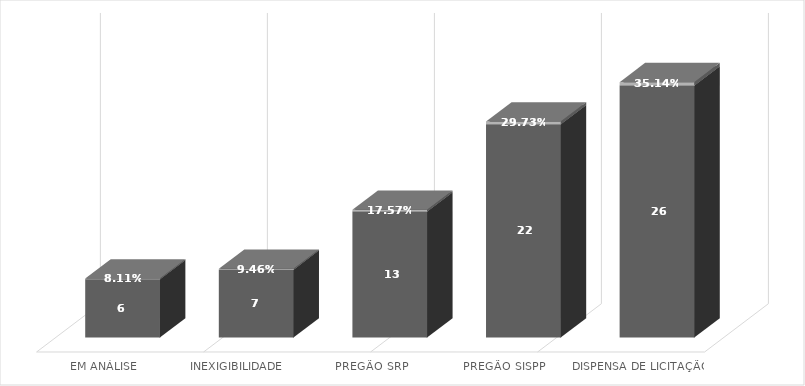
| Category | Contagem de Processo nº | Contagem de Processo nº2 |
|---|---|---|
| EM ANÁLISE | 6 | 0.081 |
| INEXIGIBILIDADE | 7 | 0.095 |
| PREGÃO SRP | 13 | 0.176 |
| PREGÃO SISPP | 22 | 0.297 |
| DISPENSA DE LICITAÇÃO | 26 | 0.351 |